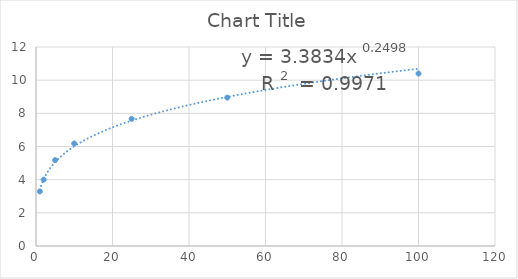
| Category | Series 0 |
|---|---|
| 1.0 | 3.29 |
| 2.0 | 4 |
| 5.0 | 5.18 |
| 10.0 | 6.18 |
| 25.0 | 7.67 |
| 50.0 | 8.95 |
| 100.0 | 10.4 |